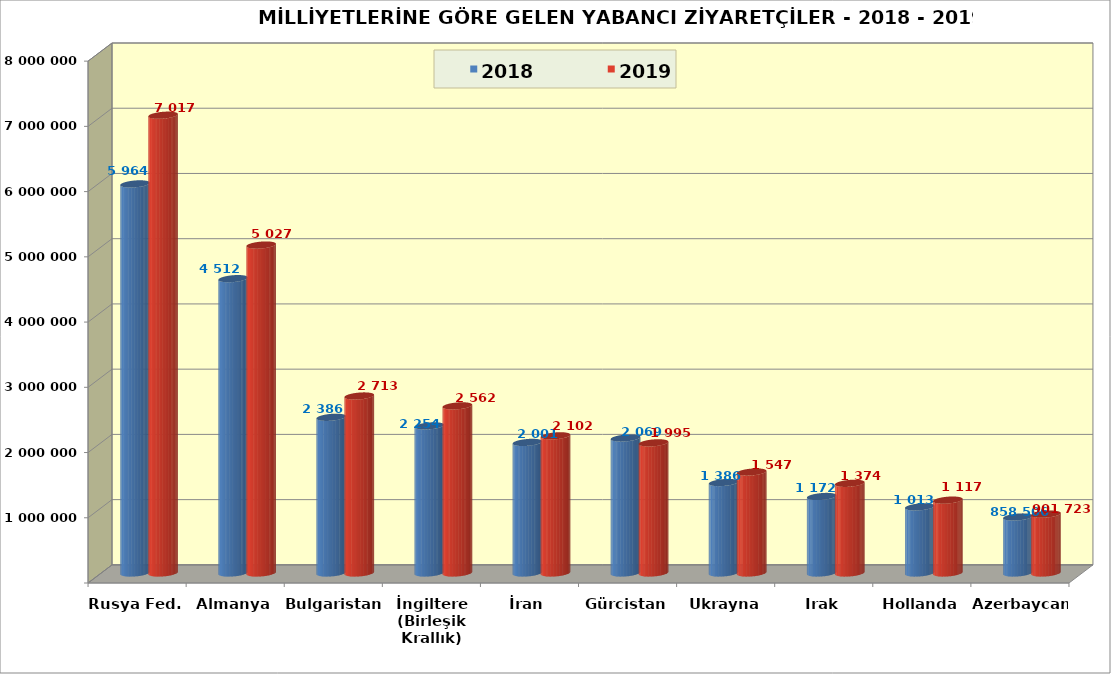
| Category | 2018 | 2019 |
|---|---|---|
| Rusya Fed. | 5964613 | 7017657 |
| Almanya | 4512360 | 5027472 |
| Bulgaristan | 2386885 | 2713464 |
| İngiltere (Birleşik Krallık) | 2254871 | 2562064 |
| İran | 2001744 | 2102890 |
| Gürcistan | 2069392 | 1995254 |
| Ukrayna | 1386934 | 1547996 |
| Irak | 1172896 | 1374896 |
| Hollanda | 1013642 | 1117290 |
| Azerbaycan | 858506 | 901723 |